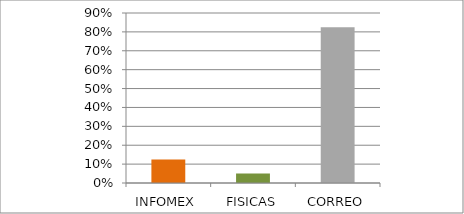
| Category | Series 0 |
|---|---|
| INFOMEX | 0.125 |
| FISICAS | 0.05 |
| CORREO | 0.825 |